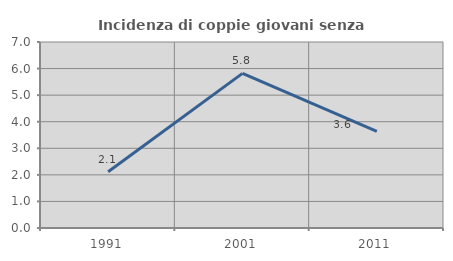
| Category | Incidenza di coppie giovani senza figli |
|---|---|
| 1991.0 | 2.116 |
| 2001.0 | 5.82 |
| 2011.0 | 3.636 |